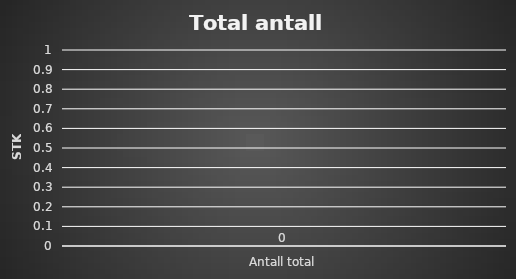
| Category | Series 0 |
|---|---|
| Antall total | 0 |